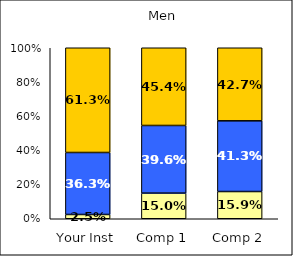
| Category | Low Civic Awareness | Average Civic Awareness | High Civic Awareness |
|---|---|---|---|
| Your Inst | 0.025 | 0.362 | 0.612 |
| Comp 1 | 0.15 | 0.396 | 0.454 |
| Comp 2 | 0.159 | 0.413 | 0.427 |